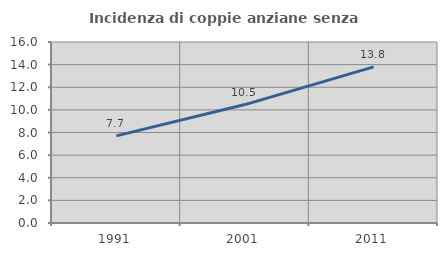
| Category | Incidenza di coppie anziane senza figli  |
|---|---|
| 1991.0 | 7.699 |
| 2001.0 | 10.469 |
| 2011.0 | 13.802 |